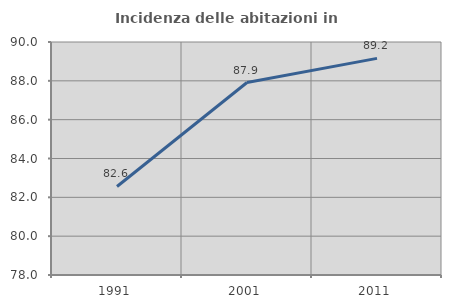
| Category | Incidenza delle abitazioni in proprietà  |
|---|---|
| 1991.0 | 82.558 |
| 2001.0 | 87.912 |
| 2011.0 | 89.157 |